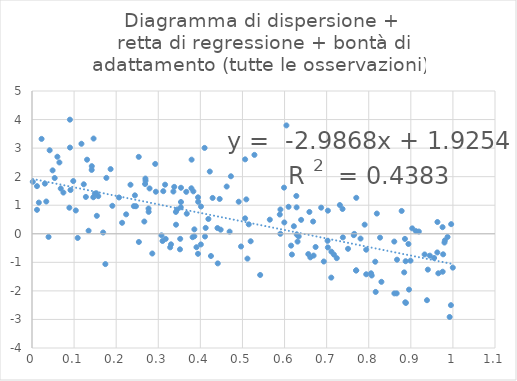
| Category | Series 0 |
|---|---|
| 0.20672523636471407 | 1.272 |
| 0.1909025193908992 | 0.979 |
| 0.9997555057780091 | -1.185 |
| 0.36649981919895125 | 1.469 |
| 0.7940271604756531 | -1.419 |
| 0.10855633568076473 | -0.146 |
| 0.412602703366748 | 0.205 |
| 0.2686896289094446 | 1.743 |
| 0.5994526903643376 | 0.397 |
| 0.2771807183867323 | 0.767 |
| 0.49112038994101814 | 1.123 |
| 0.5149139275332283 | 0.33 |
| 0.6690588175552148 | -0.763 |
| 0.6309163343113446 | -0.274 |
| 0.8672088283356914 | -0.907 |
| 0.09007021243255464 | 3.996 |
| 0.9958693042496355 | 0.337 |
| 0.8943178317866542 | -0.358 |
| 0.15402241204348655 | 0.628 |
| 0.6044444780941413 | 3.795 |
| 0.6870340730838718 | 0.915 |
| 0.3943683243768936 | -0.702 |
| 0.4725968746383167 | 2.014 |
| 0.34218796647733196 | 0.318 |
| 0.15300922242346982 | 1.418 |
| 0.04195572636058775 | 2.924 |
| 0.14631926917705218 | 3.335 |
| 0.9756618689364218 | -1.329 |
| 0.5063557493858747 | 0.54 |
| 0.9922551148500682 | -2.914 |
| 0.35211819430933 | -0.178 |
| 0.6590411255997116 | 0.764 |
| 0.598761990867731 | 1.616 |
| 0.9327619353074678 | -0.724 |
| 0.3786334061416937 | 1.593 |
| 0.0306600311128995 | 1.756 |
| 0.13082576015105207 | 2.595 |
| 0.7029395124079307 | 0.809 |
| 0.9632284240568897 | 0.412 |
| 0.8165563032014854 | -2.037 |
| 0.509197389026009 | 1.204 |
| 0.7903520436611269 | 0.32 |
| 0.34184218097544494 | 0.765 |
| 0.5194966819167923 | -0.263 |
| 0.82692874206228 | -0.135 |
| 0.03931370395508216 | -0.109 |
| 0.11748515013498151 | 3.152 |
| 0.14205092845201883 | 2.367 |
| 0.0539113128532821 | 1.952 |
| 0.8055861612187732 | -1.384 |
| 0.1690340262026666 | 0.044 |
| 0.39073724812252 | -0.471 |
| 0.14921495777639227 | 1.403 |
| 0.8782236780678897 | 0.799 |
| 0.022738451748775423 | 3.322 |
| 0.42237732566858444 | 2.179 |
| 0.9799730388069372 | -0.308 |
| 0.26944971459900924 | 1.933 |
| 0.3101160860054052 | -0.253 |
| 0.2697858463509233 | 1.857 |
| 0.3515670394888356 | -0.545 |
| 0.6679110746402823 | 0.429 |
| 0.06509668350097808 | 2.498 |
| 0.011900315012503881 | 1.668 |
| 0.07457150092280818 | 1.444 |
| 0.4190459490045002 | 0.519 |
| 0.27686841998461165 | 0.885 |
| 0.08878821516075719 | 0.913 |
| 0.5900026582344783 | -0.001 |
| 0.44590703325303604 | 1.22 |
| 0.4966303439255427 | -0.445 |
| 0.976799839516091 | -0.719 |
| 0.7704225226201361 | 1.26 |
| 0.1229599882596385 | 1.733 |
| 0.6336352246244114 | -0.093 |
| 0.09026597946830872 | 3.019 |
| 0.8663834069766293 | -2.088 |
| 0.9553442426825646 | -0.848 |
| 0.8876520379832444 | -0.961 |
| 0.2857917699251806 | -0.691 |
| 0.3379408369676207 | 1.642 |
| 0.884274491625814 | -1.352 |
| 0.15736367702152199 | 1.317 |
| 0.17429461967330995 | -1.062 |
| 0.90345393587378 | 0.189 |
| 0.31619658488275504 | 1.719 |
| 0.5902712161246702 | 0.85 |
| 0.617508459542751 | -0.727 |
| 0.8154900176703531 | -0.978 |
| 0.7655803694452672 | -0.003 |
| 0.9122108735995692 | 0.092 |
| 0.17671536720661474 | 1.957 |
| 0.2140729812205996 | 0.385 |
| 0.3176160577817341 | -0.18 |
| 0.39474063127526704 | 1.119 |
| 0.35345023369826256 | 0.927 |
| 0.8192601787576593 | 0.708 |
| 0.4014363459026813 | 0.955 |
| 0.7377769882460451 | 0.869 |
| 0.9404496866907105 | -1.255 |
| 0.3358915448537034 | 1.479 |
| 0.7110187477710068 | -1.534 |
| 0.6221356965528382 | 0.264 |
| 0.3282448929005519 | -0.475 |
| 0.41098659248571345 | -0.096 |
| 0.09144599548483157 | 1.532 |
| 0.7240844323535895 | -0.854 |
| 0.5063817710491703 | 2.607 |
| 0.36768672599882835 | 0.704 |
| 0.30764369974658257 | -0.054 |
| 0.033945562188973266 | 1.13 |
| 0.25360137414386075 | 2.693 |
| 0.7805743216491201 | -0.168 |
| 0.9629356484688085 | -0.653 |
| 0.10406438136305474 | 0.816 |
| 0.6737853213048538 | -0.463 |
| 0.6156089313233514 | -0.415 |
| 0.7701762963852725 | -1.283 |
| 0.3944283167976489 | 1.277 |
| 0.9383840689027285 | -2.326 |
| 0.6612866147815727 | -0.826 |
| 0.7939797624333818 | -0.558 |
| 0.4625282537343388 | 1.654 |
| 0.7508281601015421 | -0.526 |
| 0.14568135993592668 | 1.279 |
| 0.18674178155592125 | 2.265 |
| 0.2538917280387084 | -0.287 |
| 0.9872617086434904 | -0.112 |
| 0.2793207840940616 | 1.588 |
| 0.9754331397527806 | 0.232 |
| 0.13446265455295214 | 0.106 |
| 0.6286402713633599 | 0.925 |
| 0.945115029214542 | -0.766 |
| 0.2942476512220754 | 1.473 |
| 0.886818663101682 | -2.399 |
| 0.37919104944190996 | 2.595 |
| 0.3302864923491692 | -0.37 |
| 0.38573460799304427 | 0.155 |
| 0.3447492153133481 | 0.849 |
| 0.24451421244818028 | 1.346 |
| 0.016224524066849155 | 1.092 |
| 0.09802432957328366 | 1.846 |
| 0.7645114579487324 | -0.049 |
| 0.4100679777836329 | 3.007 |
| 0.011861584718566243 | 0.839 |
| 0.14179405883991847 | 2.237 |
| 0.6280384727444852 | 1.324 |
| 0.5650025026344285 | 0.494 |
| 0.23399679532940165 | 1.717 |
| 0.5284396234706171 | 2.763 |
| 0.1279942639581313 | 1.29 |
| 0.717362652242032 | -0.729 |
| 0.6394116387892518 | 0.488 |
| 0.35394959920595015 | 1.612 |
| 0.9952881222738732 | -2.5 |
| 0.3118913370458628 | 1.492 |
| 0.4482175109653497 | 0.143 |
| 0.24693353883118163 | 0.964 |
| 0.8609143069074174 | -2.088 |
| 0.4251284355426701 | -0.778 |
| 0.693206579131622 | -0.971 |
| 0.5420951489092601 | -1.443 |
| 0.8883860582534221 | -2.421 |
| 0.4694759958894852 | 0.075 |
| 0.9190491937900227 | 0.078 |
| 0.860706859168648 | -0.273 |
| 0.7702763375225993 | -1.284 |
| 0.0682830808093059 | 1.584 |
| 0.899245465825687 | -0.942 |
| 0.4011823672376764 | -0.374 |
| 0.3815674995992303 | -0.119 |
| 0.5118457076484504 | -0.87 |
| 0.2927602194935033 | 2.446 |
| 0.24201201068195477 | 0.967 |
| 0.42914380805683927 | 1.255 |
| 0.3834051865815886 | 1.486 |
| 0.8070778112594548 | -1.461 |
| 0.3856287681009374 | -0.087 |
| 0.22370800282405912 | 0.681 |
| 0.9809605194977238 | -0.232 |
| 0.7022338572488991 | -0.245 |
| 0.4406511494569866 | 0.201 |
| 0.6564311464922865 | -0.711 |
| 0.0018931215230844067 | 1.821 |
| 0.7029153874173969 | -0.479 |
| 0.04895370097643703 | 2.221 |
| 0.2668441024284852 | 0.429 |
| 0.6289333363644146 | -0.026 |
| 0.06029552467975874 | 2.698 |
| 0.5886905879377775 | 0.675 |
| 0.8860296301586206 | -0.179 |
| 0.7114219158678777 | -0.628 |
| 0.8956812426531704 | -1.954 |
| 0.4413317130695902 | -1.037 |
| 0.8301456120121437 | -1.683 |
| 0.9653309407316926 | -1.384 |
| 0.7313877655896036 | 1.007 |
| 0.6095068507270588 | 0.945 |
| 0.3538923563598686 | 1.112 |
| 0.7385769239574578 | -0.126 |